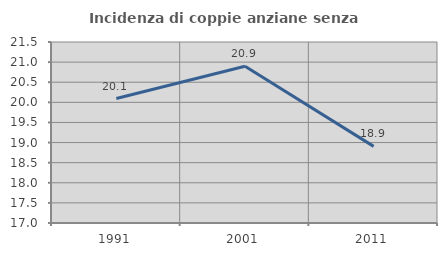
| Category | Incidenza di coppie anziane senza figli  |
|---|---|
| 1991.0 | 20.093 |
| 2001.0 | 20.896 |
| 2011.0 | 18.905 |